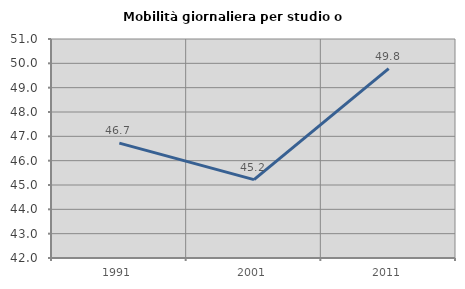
| Category | Mobilità giornaliera per studio o lavoro |
|---|---|
| 1991.0 | 46.721 |
| 2001.0 | 45.22 |
| 2011.0 | 49.784 |